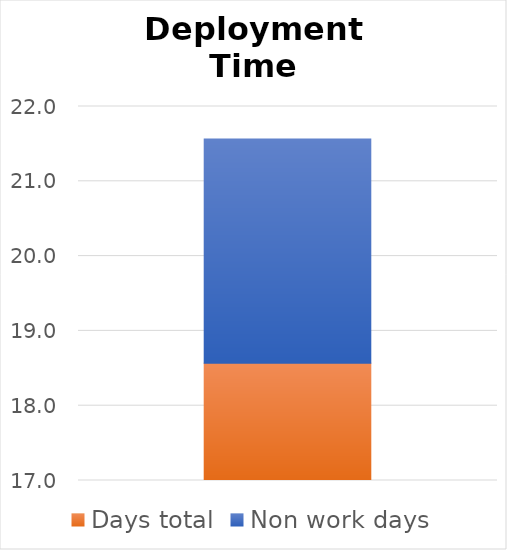
| Category | Days total | Non work days |
|---|---|---|
| 0 | 18.567 | 3 |